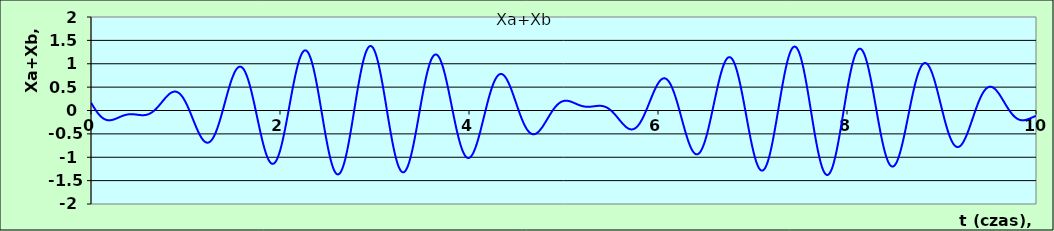
| Category | Xa+Xb |
|---|---|
| 0.0 | 0.168 |
| 0.01 | 0.134 |
| 0.02 | 0.101 |
| 0.03 | 0.068 |
| 0.04 | 0.037 |
| 0.05 | 0.006 |
| 0.06 | -0.022 |
| 0.07 | -0.05 |
| 0.08 | -0.075 |
| 0.09 | -0.098 |
| 0.1 | -0.119 |
| 0.11 | -0.138 |
| 0.12 | -0.155 |
| 0.13 | -0.169 |
| 0.14 | -0.181 |
| 0.15 | -0.191 |
| 0.16 | -0.199 |
| 0.17 | -0.204 |
| 0.18 | -0.208 |
| 0.19 | -0.209 |
| 0.2 | -0.209 |
| 0.21 | -0.207 |
| 0.22 | -0.203 |
| 0.23 | -0.198 |
| 0.24 | -0.193 |
| 0.25 | -0.186 |
| 0.26 | -0.178 |
| 0.27 | -0.17 |
| 0.28 | -0.161 |
| 0.29 | -0.152 |
| 0.3 | -0.143 |
| 0.31 | -0.134 |
| 0.32 | -0.126 |
| 0.33 | -0.118 |
| 0.34 | -0.11 |
| 0.35000000000000003 | -0.104 |
| 0.36 | -0.097 |
| 0.37 | -0.092 |
| 0.38 | -0.088 |
| 0.39 | -0.084 |
| 0.4 | -0.082 |
| 0.41000000000000003 | -0.08 |
| 0.42 | -0.079 |
| 0.43 | -0.079 |
| 0.44 | -0.08 |
| 0.45 | -0.081 |
| 0.46 | -0.083 |
| 0.47000000000000003 | -0.085 |
| 0.48 | -0.088 |
| 0.49 | -0.09 |
| 0.5 | -0.093 |
| 0.51 | -0.095 |
| 0.52 | -0.098 |
| 0.53 | -0.099 |
| 0.54 | -0.1 |
| 0.55 | -0.1 |
| 0.56 | -0.1 |
| 0.5700000000000001 | -0.098 |
| 0.58 | -0.095 |
| 0.59 | -0.09 |
| 0.6 | -0.084 |
| 0.61 | -0.077 |
| 0.62 | -0.068 |
| 0.63 | -0.057 |
| 0.64 | -0.045 |
| 0.65 | -0.031 |
| 0.66 | -0.016 |
| 0.67 | 0.001 |
| 0.68 | 0.02 |
| 0.6900000000000001 | 0.039 |
| 0.7000000000000001 | 0.061 |
| 0.71 | 0.083 |
| 0.72 | 0.106 |
| 0.73 | 0.13 |
| 0.74 | 0.154 |
| 0.75 | 0.179 |
| 0.76 | 0.203 |
| 0.77 | 0.228 |
| 0.78 | 0.252 |
| 0.79 | 0.275 |
| 0.8 | 0.297 |
| 0.81 | 0.318 |
| 0.8200000000000001 | 0.337 |
| 0.8300000000000001 | 0.354 |
| 0.84 | 0.369 |
| 0.85 | 0.382 |
| 0.86 | 0.392 |
| 0.87 | 0.399 |
| 0.88 | 0.404 |
| 0.89 | 0.405 |
| 0.9 | 0.402 |
| 0.91 | 0.396 |
| 0.92 | 0.387 |
| 0.93 | 0.374 |
| 0.9400000000000001 | 0.357 |
| 0.9500000000000001 | 0.336 |
| 0.96 | 0.312 |
| 0.97 | 0.285 |
| 0.98 | 0.254 |
| 0.99 | 0.219 |
| 1.0 | 0.182 |
| 1.01 | 0.142 |
| 1.02 | 0.099 |
| 1.03 | 0.054 |
| 1.04 | 0.008 |
| 1.05 | -0.041 |
| 1.06 | -0.09 |
| 1.07 | -0.14 |
| 1.08 | -0.191 |
| 1.09 | -0.241 |
| 1.1 | -0.291 |
| 1.11 | -0.34 |
| 1.12 | -0.387 |
| 1.1300000000000001 | -0.433 |
| 1.1400000000000001 | -0.476 |
| 1.1500000000000001 | -0.516 |
| 1.16 | -0.553 |
| 1.17 | -0.586 |
| 1.18 | -0.615 |
| 1.19 | -0.64 |
| 1.2 | -0.66 |
| 1.21 | -0.675 |
| 1.22 | -0.684 |
| 1.23 | -0.689 |
| 1.24 | -0.687 |
| 1.25 | -0.68 |
| 1.26 | -0.667 |
| 1.27 | -0.648 |
| 1.28 | -0.623 |
| 1.29 | -0.593 |
| 1.3 | -0.557 |
| 1.31 | -0.515 |
| 1.32 | -0.469 |
| 1.33 | -0.417 |
| 1.34 | -0.362 |
| 1.35 | -0.302 |
| 1.36 | -0.238 |
| 1.37 | -0.171 |
| 1.3800000000000001 | -0.101 |
| 1.3900000000000001 | -0.03 |
| 1.4000000000000001 | 0.043 |
| 1.41 | 0.118 |
| 1.42 | 0.192 |
| 1.43 | 0.266 |
| 1.44 | 0.34 |
| 1.45 | 0.411 |
| 1.46 | 0.481 |
| 1.47 | 0.547 |
| 1.48 | 0.611 |
| 1.49 | 0.67 |
| 1.5 | 0.724 |
| 1.51 | 0.774 |
| 1.52 | 0.817 |
| 1.53 | 0.855 |
| 1.54 | 0.886 |
| 1.55 | 0.91 |
| 1.56 | 0.927 |
| 1.57 | 0.936 |
| 1.58 | 0.938 |
| 1.59 | 0.932 |
| 1.6 | 0.918 |
| 1.61 | 0.897 |
| 1.62 | 0.868 |
| 1.6300000000000001 | 0.831 |
| 1.6400000000000001 | 0.786 |
| 1.6500000000000001 | 0.735 |
| 1.6600000000000001 | 0.677 |
| 1.67 | 0.612 |
| 1.68 | 0.542 |
| 1.69 | 0.466 |
| 1.7 | 0.386 |
| 1.71 | 0.301 |
| 1.72 | 0.213 |
| 1.73 | 0.122 |
| 1.74 | 0.029 |
| 1.75 | -0.066 |
| 1.76 | -0.161 |
| 1.77 | -0.255 |
| 1.78 | -0.349 |
| 1.79 | -0.44 |
| 1.8 | -0.529 |
| 1.81 | -0.615 |
| 1.82 | -0.696 |
| 1.83 | -0.773 |
| 1.84 | -0.844 |
| 1.85 | -0.908 |
| 1.86 | -0.966 |
| 1.87 | -1.016 |
| 1.8800000000000001 | -1.058 |
| 1.8900000000000001 | -1.092 |
| 1.9000000000000001 | -1.118 |
| 1.9100000000000001 | -1.134 |
| 1.92 | -1.141 |
| 1.93 | -1.138 |
| 1.94 | -1.126 |
| 1.95 | -1.105 |
| 1.96 | -1.074 |
| 1.97 | -1.035 |
| 1.98 | -0.986 |
| 1.99 | -0.929 |
| 2.0 | -0.863 |
| 2.0100000000000002 | -0.79 |
| 2.02 | -0.71 |
| 2.0300000000000002 | -0.624 |
| 2.04 | -0.531 |
| 2.05 | -0.433 |
| 2.06 | -0.332 |
| 2.07 | -0.226 |
| 2.08 | -0.118 |
| 2.09 | -0.008 |
| 2.1 | 0.102 |
| 2.11 | 0.213 |
| 2.12 | 0.322 |
| 2.13 | 0.43 |
| 2.14 | 0.534 |
| 2.15 | 0.635 |
| 2.16 | 0.732 |
| 2.17 | 0.823 |
| 2.18 | 0.907 |
| 2.19 | 0.985 |
| 2.2 | 1.055 |
| 2.21 | 1.117 |
| 2.22 | 1.169 |
| 2.23 | 1.213 |
| 2.24 | 1.247 |
| 2.25 | 1.27 |
| 2.2600000000000002 | 1.283 |
| 2.27 | 1.286 |
| 2.2800000000000002 | 1.278 |
| 2.29 | 1.259 |
| 2.3000000000000003 | 1.23 |
| 2.31 | 1.191 |
| 2.32 | 1.142 |
| 2.33 | 1.083 |
| 2.34 | 1.014 |
| 2.35 | 0.938 |
| 2.36 | 0.853 |
| 2.37 | 0.76 |
| 2.38 | 0.661 |
| 2.39 | 0.556 |
| 2.4 | 0.446 |
| 2.41 | 0.332 |
| 2.42 | 0.215 |
| 2.43 | 0.096 |
| 2.44 | -0.025 |
| 2.45 | -0.146 |
| 2.46 | -0.266 |
| 2.47 | -0.384 |
| 2.48 | -0.5 |
| 2.49 | -0.611 |
| 2.5 | -0.718 |
| 2.5100000000000002 | -0.82 |
| 2.52 | -0.915 |
| 2.5300000000000002 | -1.002 |
| 2.54 | -1.082 |
| 2.5500000000000003 | -1.153 |
| 2.56 | -1.215 |
| 2.57 | -1.266 |
| 2.58 | -1.308 |
| 2.59 | -1.338 |
| 2.6 | -1.358 |
| 2.61 | -1.367 |
| 2.62 | -1.364 |
| 2.63 | -1.35 |
| 2.64 | -1.325 |
| 2.65 | -1.289 |
| 2.66 | -1.242 |
| 2.67 | -1.185 |
| 2.68 | -1.118 |
| 2.69 | -1.042 |
| 2.7 | -0.957 |
| 2.71 | -0.864 |
| 2.72 | -0.764 |
| 2.73 | -0.658 |
| 2.74 | -0.546 |
| 2.75 | -0.429 |
| 2.7600000000000002 | -0.309 |
| 2.77 | -0.186 |
| 2.7800000000000002 | -0.061 |
| 2.79 | 0.064 |
| 2.8000000000000003 | 0.189 |
| 2.81 | 0.312 |
| 2.82 | 0.432 |
| 2.83 | 0.549 |
| 2.84 | 0.662 |
| 2.85 | 0.769 |
| 2.86 | 0.87 |
| 2.87 | 0.963 |
| 2.88 | 1.049 |
| 2.89 | 1.126 |
| 2.9 | 1.194 |
| 2.91 | 1.252 |
| 2.92 | 1.299 |
| 2.93 | 1.336 |
| 2.94 | 1.361 |
| 2.95 | 1.376 |
| 2.96 | 1.379 |
| 2.97 | 1.371 |
| 2.98 | 1.351 |
| 2.99 | 1.321 |
| 3.0 | 1.279 |
| 3.0100000000000002 | 1.227 |
| 3.02 | 1.165 |
| 3.0300000000000002 | 1.094 |
| 3.04 | 1.014 |
| 3.0500000000000003 | 0.925 |
| 3.06 | 0.829 |
| 3.0700000000000003 | 0.726 |
| 3.08 | 0.618 |
| 3.09 | 0.505 |
| 3.1 | 0.387 |
| 3.11 | 0.267 |
| 3.12 | 0.145 |
| 3.13 | 0.022 |
| 3.14 | -0.101 |
| 3.15 | -0.223 |
| 3.16 | -0.342 |
| 3.17 | -0.459 |
| 3.18 | -0.571 |
| 3.19 | -0.678 |
| 3.2 | -0.78 |
| 3.21 | -0.875 |
| 3.22 | -0.962 |
| 3.23 | -1.041 |
| 3.24 | -1.111 |
| 3.25 | -1.172 |
| 3.2600000000000002 | -1.223 |
| 3.27 | -1.264 |
| 3.2800000000000002 | -1.294 |
| 3.29 | -1.313 |
| 3.3000000000000003 | -1.322 |
| 3.31 | -1.32 |
| 3.3200000000000003 | -1.307 |
| 3.33 | -1.283 |
| 3.34 | -1.248 |
| 3.35 | -1.204 |
| 3.36 | -1.15 |
| 3.37 | -1.087 |
| 3.38 | -1.015 |
| 3.39 | -0.935 |
| 3.4 | -0.848 |
| 3.41 | -0.754 |
| 3.42 | -0.654 |
| 3.43 | -0.55 |
| 3.44 | -0.441 |
| 3.45 | -0.33 |
| 3.46 | -0.217 |
| 3.47 | -0.102 |
| 3.48 | 0.013 |
| 3.49 | 0.127 |
| 3.5 | 0.24 |
| 3.5100000000000002 | 0.349 |
| 3.52 | 0.456 |
| 3.5300000000000002 | 0.558 |
| 3.54 | 0.654 |
| 3.5500000000000003 | 0.745 |
| 3.56 | 0.829 |
| 3.5700000000000003 | 0.906 |
| 3.58 | 0.974 |
| 3.59 | 1.035 |
| 3.6 | 1.086 |
| 3.61 | 1.128 |
| 3.62 | 1.16 |
| 3.63 | 1.183 |
| 3.64 | 1.196 |
| 3.65 | 1.199 |
| 3.66 | 1.192 |
| 3.67 | 1.176 |
| 3.68 | 1.149 |
| 3.69 | 1.114 |
| 3.7 | 1.07 |
| 3.71 | 1.017 |
| 3.72 | 0.956 |
| 3.73 | 0.889 |
| 3.74 | 0.814 |
| 3.75 | 0.733 |
| 3.7600000000000002 | 0.647 |
| 3.77 | 0.557 |
| 3.7800000000000002 | 0.462 |
| 3.79 | 0.365 |
| 3.8000000000000003 | 0.266 |
| 3.81 | 0.165 |
| 3.8200000000000003 | 0.064 |
| 3.83 | -0.037 |
| 3.84 | -0.136 |
| 3.85 | -0.233 |
| 3.86 | -0.328 |
| 3.87 | -0.419 |
| 3.88 | -0.505 |
| 3.89 | -0.586 |
| 3.9 | -0.662 |
| 3.91 | -0.732 |
| 3.92 | -0.794 |
| 3.93 | -0.85 |
| 3.94 | -0.898 |
| 3.95 | -0.938 |
| 3.96 | -0.97 |
| 3.97 | -0.994 |
| 3.98 | -1.009 |
| 3.99 | -1.016 |
| 4.0 | -1.014 |
| 4.01 | -1.004 |
| 4.0200000000000005 | -0.986 |
| 4.03 | -0.96 |
| 4.04 | -0.927 |
| 4.05 | -0.886 |
| 4.0600000000000005 | -0.839 |
| 4.07 | -0.785 |
| 4.08 | -0.726 |
| 4.09 | -0.662 |
| 4.1 | -0.593 |
| 4.11 | -0.52 |
| 4.12 | -0.444 |
| 4.13 | -0.365 |
| 4.14 | -0.284 |
| 4.15 | -0.203 |
| 4.16 | -0.12 |
| 4.17 | -0.038 |
| 4.18 | 0.043 |
| 4.19 | 0.122 |
| 4.2 | 0.199 |
| 4.21 | 0.274 |
| 4.22 | 0.345 |
| 4.23 | 0.412 |
| 4.24 | 0.474 |
| 4.25 | 0.532 |
| 4.26 | 0.584 |
| 4.2700000000000005 | 0.631 |
| 4.28 | 0.672 |
| 4.29 | 0.706 |
| 4.3 | 0.734 |
| 4.3100000000000005 | 0.756 |
| 4.32 | 0.771 |
| 4.33 | 0.78 |
| 4.34 | 0.782 |
| 4.3500000000000005 | 0.777 |
| 4.36 | 0.766 |
| 4.37 | 0.75 |
| 4.38 | 0.727 |
| 4.39 | 0.699 |
| 4.4 | 0.666 |
| 4.41 | 0.628 |
| 4.42 | 0.586 |
| 4.43 | 0.539 |
| 4.44 | 0.49 |
| 4.45 | 0.437 |
| 4.46 | 0.382 |
| 4.47 | 0.326 |
| 4.48 | 0.267 |
| 4.49 | 0.208 |
| 4.5 | 0.149 |
| 4.51 | 0.09 |
| 4.5200000000000005 | 0.032 |
| 4.53 | -0.026 |
| 4.54 | -0.081 |
| 4.55 | -0.135 |
| 4.5600000000000005 | -0.186 |
| 4.57 | -0.234 |
| 4.58 | -0.279 |
| 4.59 | -0.321 |
| 4.6000000000000005 | -0.359 |
| 4.61 | -0.392 |
| 4.62 | -0.422 |
| 4.63 | -0.447 |
| 4.64 | -0.468 |
| 4.65 | -0.485 |
| 4.66 | -0.497 |
| 4.67 | -0.505 |
| 4.68 | -0.508 |
| 4.69 | -0.507 |
| 4.7 | -0.502 |
| 4.71 | -0.493 |
| 4.72 | -0.48 |
| 4.73 | -0.464 |
| 4.74 | -0.445 |
| 4.75 | -0.423 |
| 4.76 | -0.398 |
| 4.7700000000000005 | -0.371 |
| 4.78 | -0.342 |
| 4.79 | -0.311 |
| 4.8 | -0.279 |
| 4.8100000000000005 | -0.246 |
| 4.82 | -0.212 |
| 4.83 | -0.179 |
| 4.84 | -0.145 |
| 4.8500000000000005 | -0.111 |
| 4.86 | -0.079 |
| 4.87 | -0.047 |
| 4.88 | -0.016 |
| 4.89 | 0.013 |
| 4.9 | 0.041 |
| 4.91 | 0.067 |
| 4.92 | 0.091 |
| 4.93 | 0.113 |
| 4.94 | 0.132 |
| 4.95 | 0.15 |
| 4.96 | 0.165 |
| 4.97 | 0.178 |
| 4.98 | 0.188 |
| 4.99 | 0.197 |
| 5.0 | 0.203 |
| 5.01 | 0.207 |
| 5.0200000000000005 | 0.209 |
| 5.03 | 0.209 |
| 5.04 | 0.208 |
| 5.05 | 0.205 |
| 5.0600000000000005 | 0.2 |
| 5.07 | 0.195 |
| 5.08 | 0.188 |
| 5.09 | 0.18 |
| 5.1000000000000005 | 0.172 |
| 5.11 | 0.164 |
| 5.12 | 0.155 |
| 5.13 | 0.146 |
| 5.14 | 0.137 |
| 5.15 | 0.129 |
| 5.16 | 0.12 |
| 5.17 | 0.113 |
| 5.18 | 0.106 |
| 5.19 | 0.099 |
| 5.2 | 0.094 |
| 5.21 | 0.089 |
| 5.22 | 0.085 |
| 5.23 | 0.082 |
| 5.24 | 0.08 |
| 5.25 | 0.079 |
| 5.26 | 0.079 |
| 5.2700000000000005 | 0.079 |
| 5.28 | 0.081 |
| 5.29 | 0.082 |
| 5.3 | 0.084 |
| 5.3100000000000005 | 0.087 |
| 5.32 | 0.089 |
| 5.33 | 0.092 |
| 5.34 | 0.095 |
| 5.3500000000000005 | 0.097 |
| 5.36 | 0.099 |
| 5.37 | 0.1 |
| 5.38 | 0.1 |
| 5.39 | 0.1 |
| 5.4 | 0.098 |
| 5.41 | 0.096 |
| 5.42 | 0.092 |
| 5.43 | 0.086 |
| 5.44 | 0.08 |
| 5.45 | 0.071 |
| 5.46 | 0.061 |
| 5.47 | 0.049 |
| 5.48 | 0.036 |
| 5.49 | 0.021 |
| 5.5 | 0.005 |
| 5.51 | -0.013 |
| 5.5200000000000005 | -0.033 |
| 5.53 | -0.054 |
| 5.54 | -0.075 |
| 5.55 | -0.098 |
| 5.5600000000000005 | -0.122 |
| 5.57 | -0.146 |
| 5.58 | -0.171 |
| 5.59 | -0.195 |
| 5.6000000000000005 | -0.22 |
| 5.61 | -0.244 |
| 5.62 | -0.267 |
| 5.63 | -0.29 |
| 5.64 | -0.311 |
| 5.65 | -0.331 |
| 5.66 | -0.349 |
| 5.67 | -0.365 |
| 5.68 | -0.378 |
| 5.69 | -0.389 |
| 5.7 | -0.397 |
| 5.71 | -0.403 |
| 5.72 | -0.405 |
| 5.73 | -0.403 |
| 5.74 | -0.399 |
| 5.75 | -0.39 |
| 5.76 | -0.378 |
| 5.7700000000000005 | -0.363 |
| 5.78 | -0.343 |
| 5.79 | -0.32 |
| 5.8 | -0.294 |
| 5.8100000000000005 | -0.264 |
| 5.82 | -0.231 |
| 5.83 | -0.194 |
| 5.84 | -0.155 |
| 5.8500000000000005 | -0.113 |
| 5.86 | -0.069 |
| 5.87 | -0.023 |
| 5.88 | 0.025 |
| 5.89 | 0.074 |
| 5.9 | 0.124 |
| 5.91 | 0.175 |
| 5.92 | 0.225 |
| 5.93 | 0.275 |
| 5.94 | 0.324 |
| 5.95 | 0.372 |
| 5.96 | 0.418 |
| 5.97 | 0.462 |
| 5.98 | 0.503 |
| 5.99 | 0.541 |
| 6.0 | 0.576 |
| 6.01 | 0.606 |
| 6.0200000000000005 | 0.632 |
| 6.03 | 0.654 |
| 6.04 | 0.671 |
| 6.05 | 0.682 |
| 6.0600000000000005 | 0.688 |
| 6.07 | 0.688 |
| 6.08 | 0.683 |
| 6.09 | 0.672 |
| 6.1000000000000005 | 0.655 |
| 6.11 | 0.632 |
| 6.12 | 0.603 |
| 6.13 | 0.569 |
| 6.140000000000001 | 0.529 |
| 6.15 | 0.484 |
| 6.16 | 0.434 |
| 6.17 | 0.38 |
| 6.18 | 0.321 |
| 6.19 | 0.259 |
| 6.2 | 0.193 |
| 6.21 | 0.124 |
| 6.22 | 0.053 |
| 6.23 | -0.02 |
| 6.24 | -0.094 |
| 6.25 | -0.168 |
| 6.26 | -0.243 |
| 6.2700000000000005 | -0.316 |
| 6.28 | -0.388 |
| 6.29 | -0.459 |
| 6.3 | -0.526 |
| 6.3100000000000005 | -0.591 |
| 6.32 | -0.651 |
| 6.33 | -0.707 |
| 6.34 | -0.758 |
| 6.3500000000000005 | -0.804 |
| 6.36 | -0.843 |
| 6.37 | -0.877 |
| 6.38 | -0.903 |
| 6.390000000000001 | -0.922 |
| 6.4 | -0.934 |
| 6.41 | -0.938 |
| 6.42 | -0.935 |
| 6.43 | -0.924 |
| 6.44 | -0.905 |
| 6.45 | -0.878 |
| 6.46 | -0.843 |
| 6.47 | -0.801 |
| 6.48 | -0.752 |
| 6.49 | -0.696 |
| 6.5 | -0.634 |
| 6.51 | -0.565 |
| 6.5200000000000005 | -0.491 |
| 6.53 | -0.412 |
| 6.54 | -0.329 |
| 6.55 | -0.242 |
| 6.5600000000000005 | -0.151 |
| 6.57 | -0.059 |
| 6.58 | 0.035 |
| 6.59 | 0.13 |
| 6.6000000000000005 | 0.225 |
| 6.61 | 0.319 |
| 6.62 | 0.411 |
| 6.63 | 0.501 |
| 6.640000000000001 | 0.588 |
| 6.65 | 0.671 |
| 6.66 | 0.749 |
| 6.67 | 0.822 |
| 6.68 | 0.888 |
| 6.69 | 0.948 |
| 6.7 | 1.001 |
| 6.71 | 1.046 |
| 6.72 | 1.082 |
| 6.73 | 1.11 |
| 6.74 | 1.13 |
| 6.75 | 1.139 |
| 6.76 | 1.14 |
| 6.7700000000000005 | 1.131 |
| 6.78 | 1.113 |
| 6.79 | 1.085 |
| 6.8 | 1.048 |
| 6.8100000000000005 | 1.003 |
| 6.82 | 0.948 |
| 6.83 | 0.885 |
| 6.84 | 0.815 |
| 6.8500000000000005 | 0.737 |
| 6.86 | 0.652 |
| 6.87 | 0.561 |
| 6.88 | 0.465 |
| 6.890000000000001 | 0.365 |
| 6.9 | 0.26 |
| 6.91 | 0.153 |
| 6.92 | 0.044 |
| 6.93 | -0.066 |
| 6.94 | -0.177 |
| 6.95 | -0.287 |
| 6.96 | -0.395 |
| 6.97 | -0.501 |
| 6.98 | -0.603 |
| 6.99 | -0.701 |
| 7.0 | -0.794 |
| 7.01 | -0.881 |
| 7.0200000000000005 | -0.961 |
| 7.03 | -1.033 |
| 7.04 | -1.098 |
| 7.05 | -1.153 |
| 7.0600000000000005 | -1.2 |
| 7.07 | -1.237 |
| 7.08 | -1.264 |
| 7.09 | -1.28 |
| 7.1000000000000005 | -1.286 |
| 7.11 | -1.282 |
| 7.12 | -1.267 |
| 7.13 | -1.241 |
| 7.140000000000001 | -1.205 |
| 7.15 | -1.159 |
| 7.16 | -1.103 |
| 7.17 | -1.037 |
| 7.18 | -0.963 |
| 7.19 | -0.881 |
| 7.2 | -0.791 |
| 7.21 | -0.694 |
| 7.22 | -0.591 |
| 7.23 | -0.482 |
| 7.24 | -0.369 |
| 7.25 | -0.253 |
| 7.26 | -0.134 |
| 7.2700000000000005 | -0.014 |
| 7.28 | 0.107 |
| 7.29 | 0.227 |
| 7.3 | 0.346 |
| 7.3100000000000005 | 0.463 |
| 7.32 | 0.576 |
| 7.33 | 0.684 |
| 7.34 | 0.788 |
| 7.3500000000000005 | 0.885 |
| 7.36 | 0.975 |
| 7.37 | 1.057 |
| 7.38 | 1.131 |
| 7.390000000000001 | 1.196 |
| 7.4 | 1.251 |
| 7.41 | 1.295 |
| 7.42 | 1.33 |
| 7.43 | 1.353 |
| 7.44 | 1.365 |
| 7.45 | 1.366 |
| 7.46 | 1.356 |
| 7.47 | 1.334 |
| 7.48 | 1.302 |
| 7.49 | 1.258 |
| 7.5 | 1.205 |
| 7.51 | 1.141 |
| 7.5200000000000005 | 1.068 |
| 7.53 | 0.985 |
| 7.54 | 0.895 |
| 7.55 | 0.797 |
| 7.5600000000000005 | 0.693 |
| 7.57 | 0.582 |
| 7.58 | 0.467 |
| 7.59 | 0.348 |
| 7.6000000000000005 | 0.225 |
| 7.61 | 0.101 |
| 7.62 | -0.024 |
| 7.63 | -0.149 |
| 7.640000000000001 | -0.272 |
| 7.65 | -0.394 |
| 7.66 | -0.512 |
| 7.67 | -0.626 |
| 7.68 | -0.735 |
| 7.69 | -0.838 |
| 7.7 | -0.934 |
| 7.71 | -1.022 |
| 7.72 | -1.102 |
| 7.73 | -1.173 |
| 7.74 | -1.234 |
| 7.75 | -1.285 |
| 7.76 | -1.325 |
| 7.7700000000000005 | -1.354 |
| 7.78 | -1.373 |
| 7.79 | -1.379 |
| 7.8 | -1.375 |
| 7.8100000000000005 | -1.359 |
| 7.82 | -1.332 |
| 7.83 | -1.294 |
| 7.84 | -1.245 |
| 7.8500000000000005 | -1.186 |
| 7.86 | -1.118 |
| 7.87 | -1.04 |
| 7.88 | -0.954 |
| 7.890000000000001 | -0.861 |
| 7.9 | -0.76 |
| 7.91 | -0.653 |
| 7.92 | -0.542 |
| 7.930000000000001 | -0.426 |
| 7.94 | -0.306 |
| 7.95 | -0.185 |
| 7.96 | -0.062 |
| 7.97 | 0.061 |
| 7.98 | 0.184 |
| 7.99 | 0.304 |
| 8.0 | 0.422 |
| 8.01 | 0.535 |
| 8.02 | 0.644 |
| 8.03 | 0.748 |
| 8.040000000000001 | 0.845 |
| 8.05 | 0.935 |
| 8.06 | 1.016 |
| 8.07 | 1.089 |
| 8.08 | 1.153 |
| 8.09 | 1.208 |
| 8.1 | 1.252 |
| 8.11 | 1.285 |
| 8.120000000000001 | 1.308 |
| 8.13 | 1.32 |
| 8.14 | 1.322 |
| 8.15 | 1.312 |
| 8.16 | 1.292 |
| 8.17 | 1.261 |
| 8.18 | 1.219 |
| 8.19 | 1.168 |
| 8.2 | 1.108 |
| 8.21 | 1.039 |
| 8.22 | 0.961 |
| 8.23 | 0.876 |
| 8.24 | 0.785 |
| 8.25 | 0.687 |
| 8.26 | 0.584 |
| 8.27 | 0.477 |
| 8.28 | 0.366 |
| 8.290000000000001 | 0.253 |
| 8.3 | 0.139 |
| 8.31 | 0.024 |
| 8.32 | -0.091 |
| 8.33 | -0.204 |
| 8.34 | -0.314 |
| 8.35 | -0.422 |
| 8.36 | -0.525 |
| 8.370000000000001 | -0.624 |
| 8.38 | -0.716 |
| 8.39 | -0.803 |
| 8.4 | -0.882 |
| 8.41 | -0.953 |
| 8.42 | -1.016 |
| 8.43 | -1.07 |
| 8.44 | -1.115 |
| 8.45 | -1.151 |
| 8.46 | -1.177 |
| 8.47 | -1.193 |
| 8.48 | -1.199 |
| 8.49 | -1.195 |
| 8.5 | -1.182 |
| 8.51 | -1.159 |
| 8.52 | -1.126 |
| 8.53 | -1.085 |
| 8.540000000000001 | -1.035 |
| 8.55 | -0.977 |
| 8.56 | -0.911 |
| 8.57 | -0.839 |
| 8.58 | -0.76 |
| 8.59 | -0.675 |
| 8.6 | -0.586 |
| 8.61 | -0.493 |
| 8.620000000000001 | -0.397 |
| 8.63 | -0.298 |
| 8.64 | -0.197 |
| 8.65 | -0.096 |
| 8.66 | 0.004 |
| 8.67 | 0.104 |
| 8.68 | 0.202 |
| 8.69 | 0.298 |
| 8.700000000000001 | 0.39 |
| 8.71 | 0.478 |
| 8.72 | 0.561 |
| 8.73 | 0.638 |
| 8.74 | 0.71 |
| 8.75 | 0.775 |
| 8.76 | 0.833 |
| 8.77 | 0.883 |
| 8.78 | 0.926 |
| 8.790000000000001 | 0.96 |
| 8.8 | 0.987 |
| 8.81 | 1.005 |
| 8.82 | 1.014 |
| 8.83 | 1.015 |
| 8.84 | 1.008 |
| 8.85 | 0.993 |
| 8.86 | 0.969 |
| 8.870000000000001 | 0.938 |
| 8.88 | 0.9 |
| 8.89 | 0.855 |
| 8.9 | 0.803 |
| 8.91 | 0.746 |
| 8.92 | 0.683 |
| 8.93 | 0.615 |
| 8.94 | 0.544 |
| 8.950000000000001 | 0.468 |
| 8.96 | 0.39 |
| 8.97 | 0.31 |
| 8.98 | 0.229 |
| 8.99 | 0.147 |
| 9.0 | 0.065 |
| 9.01 | -0.017 |
| 9.02 | -0.097 |
| 9.03 | -0.175 |
| 9.040000000000001 | -0.25 |
| 9.05 | -0.322 |
| 9.06 | -0.391 |
| 9.07 | -0.455 |
| 9.08 | -0.514 |
| 9.09 | -0.568 |
| 9.1 | -0.617 |
| 9.11 | -0.659 |
| 9.120000000000001 | -0.696 |
| 9.13 | -0.726 |
| 9.14 | -0.75 |
| 9.15 | -0.767 |
| 9.16 | -0.778 |
| 9.17 | -0.782 |
| 9.18 | -0.779 |
| 9.19 | -0.77 |
| 9.200000000000001 | -0.756 |
| 9.21 | -0.735 |
| 9.22 | -0.709 |
| 9.23 | -0.677 |
| 9.24 | -0.641 |
| 9.25 | -0.6 |
| 9.26 | -0.555 |
| 9.27 | -0.506 |
| 9.28 | -0.454 |
| 9.290000000000001 | -0.4 |
| 9.3 | -0.344 |
| 9.31 | -0.286 |
| 9.32 | -0.227 |
| 9.33 | -0.168 |
| 9.34 | -0.109 |
| 9.35 | -0.05 |
| 9.36 | 0.007 |
| 9.370000000000001 | 0.064 |
| 9.38 | 0.118 |
| 9.39 | 0.17 |
| 9.4 | 0.219 |
| 9.41 | 0.265 |
| 9.42 | 0.308 |
| 9.43 | 0.347 |
| 9.44 | 0.382 |
| 9.450000000000001 | 0.413 |
| 9.46 | 0.44 |
| 9.47 | 0.462 |
| 9.48 | 0.48 |
| 9.49 | 0.494 |
| 9.5 | 0.503 |
| 9.51 | 0.507 |
| 9.52 | 0.508 |
| 9.53 | 0.504 |
| 9.540000000000001 | 0.496 |
| 9.55 | 0.485 |
| 9.56 | 0.47 |
| 9.57 | 0.452 |
| 9.58 | 0.43 |
| 9.59 | 0.406 |
| 9.6 | 0.38 |
| 9.61 | 0.351 |
| 9.620000000000001 | 0.321 |
| 9.63 | 0.289 |
| 9.64 | 0.257 |
| 9.65 | 0.223 |
| 9.66 | 0.19 |
| 9.67 | 0.156 |
| 9.68 | 0.122 |
| 9.69 | 0.089 |
| 9.700000000000001 | 0.057 |
| 9.71 | 0.026 |
| 9.72 | -0.004 |
| 9.73 | -0.032 |
| 9.74 | -0.059 |
| 9.75 | -0.083 |
| 9.76 | -0.106 |
| 9.77 | -0.126 |
| 9.78 | -0.144 |
| 9.790000000000001 | -0.16 |
| 9.8 | -0.174 |
| 9.81 | -0.185 |
| 9.82 | -0.194 |
| 9.83 | -0.201 |
| 9.84 | -0.206 |
| 9.85 | -0.208 |
| 9.86 | -0.209 |
| 9.870000000000001 | -0.208 |
| 9.88 | -0.206 |
| 9.89 | -0.202 |
| 9.9 | -0.196 |
| 9.91 | -0.19 |
| 9.92 | -0.183 |
| 9.93 | -0.175 |
| 9.94 | -0.167 |
| 9.950000000000001 | -0.158 |
| 9.96 | -0.149 |
| 9.97 | -0.14 |
| 9.98 | -0.131 |
| 9.99 | -0.123 |
| 10.0 | -0.115 |